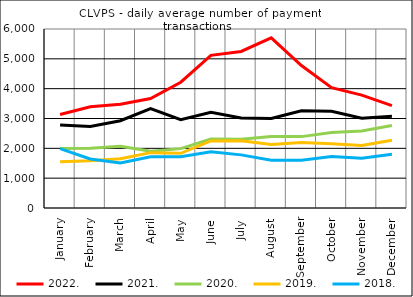
| Category | 2022. | 2021. | 2020. | 2019. | 2018. |
|---|---|---|---|---|---|
| January | 3136.05 | 2785.263 | 1995 | 1547.409 | 1988.182 |
| February | 3391.7 | 2730.2 | 2005.5 | 1580 | 1644.85 |
| March | 3480.435 | 2925.739 | 2073.227 | 1650.81 | 1510.545 |
| April | 3667.8 | 3333.143 | 1899.857 | 1855.381 | 1715.55 |
| May | 4216 | 2962.286 | 1990.4 | 1833.818 | 1721.714 |
| June | 5117.15 | 3207.65 | 2311.8 | 2248.444 | 1881.158 |
| July | 5247.19 | 3016.864 | 2306.913 | 2252.435 | 1781.091 |
| August | 5702.429 | 3003.286 | 2394.7 | 2125.8 | 1597.364 |
| September | 4776.182 | 3260.636 | 2392.727 | 2193.333 | 1602.9 |
| October | 4035.667 | 3239.952 | 2532.045 | 2152.5 | 1727.318 |
| November | 3783.95 | 3006.45 | 2580.6 | 2098.6 | 1671.381 |
| December | 3432.524 | 3072.217 | 2764.227 | 2272 | 1804.474 |